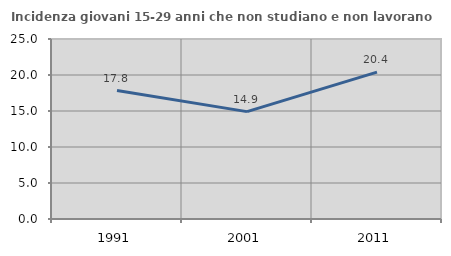
| Category | Incidenza giovani 15-29 anni che non studiano e non lavorano  |
|---|---|
| 1991.0 | 17.842 |
| 2001.0 | 14.912 |
| 2011.0 | 20.392 |